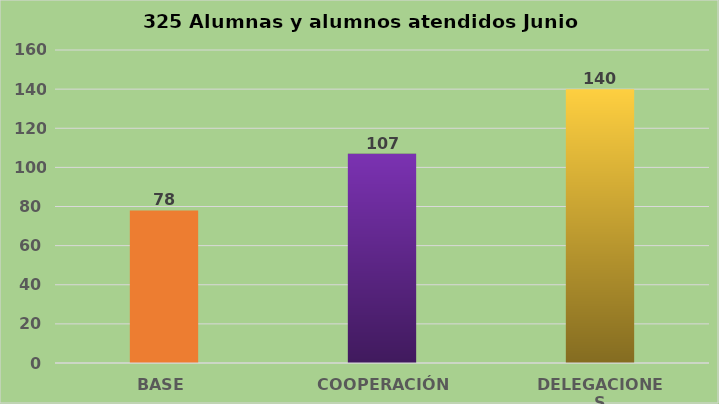
| Category | Series 0 |
|---|---|
| BASE | 78 |
| COOPERACIÓN | 107 |
| DELEGACIONES | 140 |